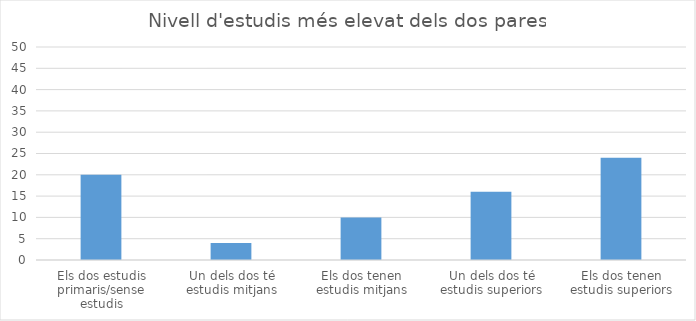
| Category | Series 0 |
|---|---|
| Els dos estudis primaris/sense estudis | 20 |
| Un dels dos té estudis mitjans | 4 |
| Els dos tenen estudis mitjans | 10 |
| Un dels dos té estudis superiors | 16 |
| Els dos tenen estudis superiors | 24 |